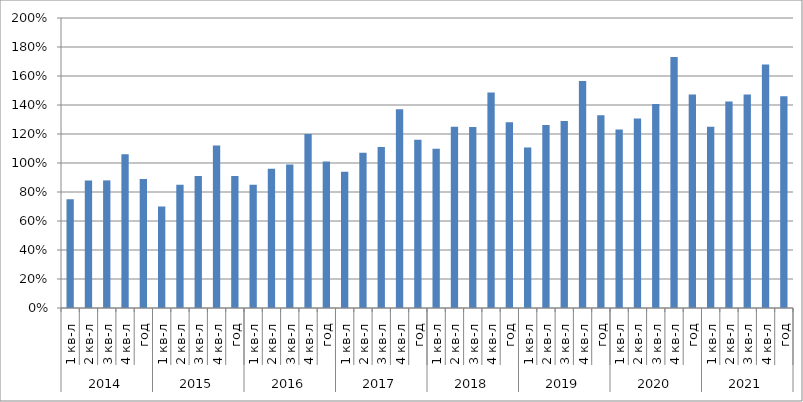
| Category | Series 0 |
|---|---|
| 0 | 0.75 |
| 1 | 0.88 |
| 2 | 0.88 |
| 3 | 1.06 |
| 4 | 0.89 |
| 5 | 0.7 |
| 6 | 0.85 |
| 7 | 0.91 |
| 8 | 1.12 |
| 9 | 0.91 |
| 10 | 0.85 |
| 11 | 0.96 |
| 12 | 0.99 |
| 13 | 1.2 |
| 14 | 1.01 |
| 15 | 0.94 |
| 16 | 1.07 |
| 17 | 1.11 |
| 18 | 1.37 |
| 19 | 1.16 |
| 20 | 1.099 |
| 21 | 1.249 |
| 22 | 1.249 |
| 23 | 1.487 |
| 24 | 1.281 |
| 25 | 1.107 |
| 26 | 1.262 |
| 27 | 1.29 |
| 28 | 1.566 |
| 29 | 1.33 |
| 30 | 1.232 |
| 31 | 1.307 |
| 32 | 1.407 |
| 33 | 1.732 |
| 34 | 1.473 |
| 35 | 1.251 |
| 36 | 1.424 |
| 37 | 1.473 |
| 38 | 1.68 |
| 39 | 1.461 |